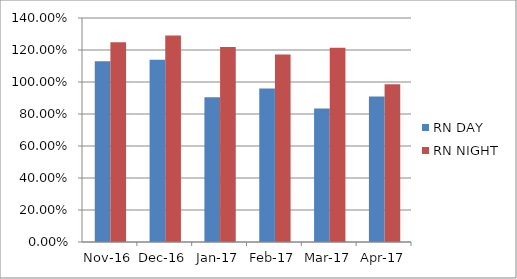
| Category | RN DAY | RN NIGHT |
|---|---|---|
| 2016-11-01 | 1.13 | 1.248 |
| 2016-12-01 | 1.139 | 1.29 |
| 2017-01-01 | 0.905 | 1.218 |
| 2017-02-01 | 0.96 | 1.173 |
| 2017-03-01 | 0.834 | 1.214 |
| 2017-04-01 | 0.909 | 0.986 |